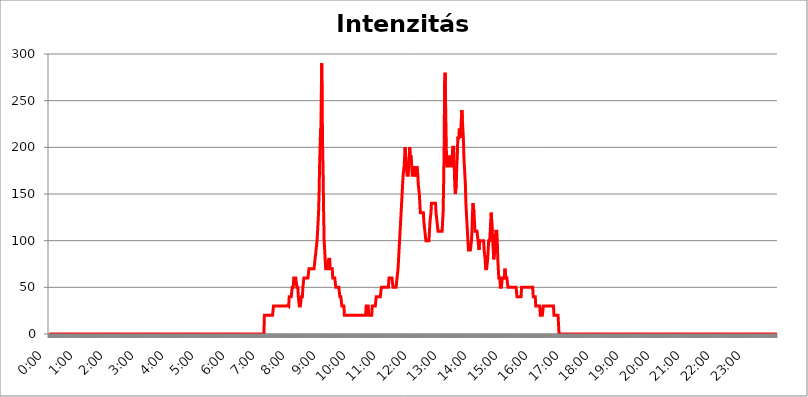
| Category | Intenzitás (W/m2) |
|---|---|
| 0.0 | 0 |
| 0.0006944444444444445 | 0 |
| 0.001388888888888889 | 0 |
| 0.0020833333333333333 | 0 |
| 0.002777777777777778 | 0 |
| 0.003472222222222222 | 0 |
| 0.004166666666666667 | 0 |
| 0.004861111111111111 | 0 |
| 0.005555555555555556 | 0 |
| 0.0062499999999999995 | 0 |
| 0.006944444444444444 | 0 |
| 0.007638888888888889 | 0 |
| 0.008333333333333333 | 0 |
| 0.009027777777777779 | 0 |
| 0.009722222222222222 | 0 |
| 0.010416666666666666 | 0 |
| 0.011111111111111112 | 0 |
| 0.011805555555555555 | 0 |
| 0.012499999999999999 | 0 |
| 0.013194444444444444 | 0 |
| 0.013888888888888888 | 0 |
| 0.014583333333333332 | 0 |
| 0.015277777777777777 | 0 |
| 0.015972222222222224 | 0 |
| 0.016666666666666666 | 0 |
| 0.017361111111111112 | 0 |
| 0.018055555555555557 | 0 |
| 0.01875 | 0 |
| 0.019444444444444445 | 0 |
| 0.02013888888888889 | 0 |
| 0.020833333333333332 | 0 |
| 0.02152777777777778 | 0 |
| 0.022222222222222223 | 0 |
| 0.02291666666666667 | 0 |
| 0.02361111111111111 | 0 |
| 0.024305555555555556 | 0 |
| 0.024999999999999998 | 0 |
| 0.025694444444444447 | 0 |
| 0.02638888888888889 | 0 |
| 0.027083333333333334 | 0 |
| 0.027777777777777776 | 0 |
| 0.02847222222222222 | 0 |
| 0.029166666666666664 | 0 |
| 0.029861111111111113 | 0 |
| 0.030555555555555555 | 0 |
| 0.03125 | 0 |
| 0.03194444444444445 | 0 |
| 0.03263888888888889 | 0 |
| 0.03333333333333333 | 0 |
| 0.034027777777777775 | 0 |
| 0.034722222222222224 | 0 |
| 0.035416666666666666 | 0 |
| 0.036111111111111115 | 0 |
| 0.03680555555555556 | 0 |
| 0.0375 | 0 |
| 0.03819444444444444 | 0 |
| 0.03888888888888889 | 0 |
| 0.03958333333333333 | 0 |
| 0.04027777777777778 | 0 |
| 0.04097222222222222 | 0 |
| 0.041666666666666664 | 0 |
| 0.042361111111111106 | 0 |
| 0.04305555555555556 | 0 |
| 0.043750000000000004 | 0 |
| 0.044444444444444446 | 0 |
| 0.04513888888888889 | 0 |
| 0.04583333333333334 | 0 |
| 0.04652777777777778 | 0 |
| 0.04722222222222222 | 0 |
| 0.04791666666666666 | 0 |
| 0.04861111111111111 | 0 |
| 0.049305555555555554 | 0 |
| 0.049999999999999996 | 0 |
| 0.05069444444444445 | 0 |
| 0.051388888888888894 | 0 |
| 0.052083333333333336 | 0 |
| 0.05277777777777778 | 0 |
| 0.05347222222222222 | 0 |
| 0.05416666666666667 | 0 |
| 0.05486111111111111 | 0 |
| 0.05555555555555555 | 0 |
| 0.05625 | 0 |
| 0.05694444444444444 | 0 |
| 0.057638888888888885 | 0 |
| 0.05833333333333333 | 0 |
| 0.05902777777777778 | 0 |
| 0.059722222222222225 | 0 |
| 0.06041666666666667 | 0 |
| 0.061111111111111116 | 0 |
| 0.06180555555555556 | 0 |
| 0.0625 | 0 |
| 0.06319444444444444 | 0 |
| 0.06388888888888888 | 0 |
| 0.06458333333333334 | 0 |
| 0.06527777777777778 | 0 |
| 0.06597222222222222 | 0 |
| 0.06666666666666667 | 0 |
| 0.06736111111111111 | 0 |
| 0.06805555555555555 | 0 |
| 0.06874999999999999 | 0 |
| 0.06944444444444443 | 0 |
| 0.07013888888888889 | 0 |
| 0.07083333333333333 | 0 |
| 0.07152777777777779 | 0 |
| 0.07222222222222223 | 0 |
| 0.07291666666666667 | 0 |
| 0.07361111111111111 | 0 |
| 0.07430555555555556 | 0 |
| 0.075 | 0 |
| 0.07569444444444444 | 0 |
| 0.0763888888888889 | 0 |
| 0.07708333333333334 | 0 |
| 0.07777777777777778 | 0 |
| 0.07847222222222222 | 0 |
| 0.07916666666666666 | 0 |
| 0.0798611111111111 | 0 |
| 0.08055555555555556 | 0 |
| 0.08125 | 0 |
| 0.08194444444444444 | 0 |
| 0.08263888888888889 | 0 |
| 0.08333333333333333 | 0 |
| 0.08402777777777777 | 0 |
| 0.08472222222222221 | 0 |
| 0.08541666666666665 | 0 |
| 0.08611111111111112 | 0 |
| 0.08680555555555557 | 0 |
| 0.08750000000000001 | 0 |
| 0.08819444444444445 | 0 |
| 0.08888888888888889 | 0 |
| 0.08958333333333333 | 0 |
| 0.09027777777777778 | 0 |
| 0.09097222222222222 | 0 |
| 0.09166666666666667 | 0 |
| 0.09236111111111112 | 0 |
| 0.09305555555555556 | 0 |
| 0.09375 | 0 |
| 0.09444444444444444 | 0 |
| 0.09513888888888888 | 0 |
| 0.09583333333333333 | 0 |
| 0.09652777777777777 | 0 |
| 0.09722222222222222 | 0 |
| 0.09791666666666667 | 0 |
| 0.09861111111111111 | 0 |
| 0.09930555555555555 | 0 |
| 0.09999999999999999 | 0 |
| 0.10069444444444443 | 0 |
| 0.1013888888888889 | 0 |
| 0.10208333333333335 | 0 |
| 0.10277777777777779 | 0 |
| 0.10347222222222223 | 0 |
| 0.10416666666666667 | 0 |
| 0.10486111111111111 | 0 |
| 0.10555555555555556 | 0 |
| 0.10625 | 0 |
| 0.10694444444444444 | 0 |
| 0.1076388888888889 | 0 |
| 0.10833333333333334 | 0 |
| 0.10902777777777778 | 0 |
| 0.10972222222222222 | 0 |
| 0.11041666666666666 | 0 |
| 0.1111111111111111 | 0 |
| 0.11180555555555556 | 0 |
| 0.1125 | 0 |
| 0.11319444444444444 | 0 |
| 0.11388888888888889 | 0 |
| 0.11458333333333333 | 0 |
| 0.11527777777777777 | 0 |
| 0.11597222222222221 | 0 |
| 0.11666666666666665 | 0 |
| 0.1173611111111111 | 0 |
| 0.11805555555555557 | 0 |
| 0.11875000000000001 | 0 |
| 0.11944444444444445 | 0 |
| 0.12013888888888889 | 0 |
| 0.12083333333333333 | 0 |
| 0.12152777777777778 | 0 |
| 0.12222222222222223 | 0 |
| 0.12291666666666667 | 0 |
| 0.12361111111111112 | 0 |
| 0.12430555555555556 | 0 |
| 0.125 | 0 |
| 0.12569444444444444 | 0 |
| 0.12638888888888888 | 0 |
| 0.12708333333333333 | 0 |
| 0.1277777777777778 | 0 |
| 0.12847222222222224 | 0 |
| 0.12916666666666668 | 0 |
| 0.12986111111111112 | 0 |
| 0.13055555555555556 | 0 |
| 0.13125 | 0 |
| 0.13194444444444445 | 0 |
| 0.1326388888888889 | 0 |
| 0.13333333333333333 | 0 |
| 0.13402777777777777 | 0 |
| 0.13472222222222222 | 0 |
| 0.13541666666666666 | 0 |
| 0.1361111111111111 | 0 |
| 0.13680555555555554 | 0 |
| 0.13749999999999998 | 0 |
| 0.13819444444444443 | 0 |
| 0.1388888888888889 | 0 |
| 0.13958333333333334 | 0 |
| 0.14027777777777778 | 0 |
| 0.14097222222222222 | 0 |
| 0.14166666666666666 | 0 |
| 0.1423611111111111 | 0 |
| 0.14305555555555557 | 0 |
| 0.14375000000000002 | 0 |
| 0.14444444444444446 | 0 |
| 0.1451388888888889 | 0 |
| 0.14583333333333334 | 0 |
| 0.14652777777777778 | 0 |
| 0.14722222222222223 | 0 |
| 0.14791666666666667 | 0 |
| 0.1486111111111111 | 0 |
| 0.14930555555555555 | 0 |
| 0.15 | 0 |
| 0.15069444444444444 | 0 |
| 0.15138888888888888 | 0 |
| 0.15208333333333332 | 0 |
| 0.15277777777777776 | 0 |
| 0.15347222222222223 | 0 |
| 0.15416666666666667 | 0 |
| 0.15486111111111112 | 0 |
| 0.15555555555555556 | 0 |
| 0.15625 | 0 |
| 0.15694444444444444 | 0 |
| 0.15763888888888888 | 0 |
| 0.15833333333333333 | 0 |
| 0.15902777777777777 | 0 |
| 0.15972222222222224 | 0 |
| 0.16041666666666668 | 0 |
| 0.16111111111111112 | 0 |
| 0.16180555555555556 | 0 |
| 0.1625 | 0 |
| 0.16319444444444445 | 0 |
| 0.1638888888888889 | 0 |
| 0.16458333333333333 | 0 |
| 0.16527777777777777 | 0 |
| 0.16597222222222222 | 0 |
| 0.16666666666666666 | 0 |
| 0.1673611111111111 | 0 |
| 0.16805555555555554 | 0 |
| 0.16874999999999998 | 0 |
| 0.16944444444444443 | 0 |
| 0.17013888888888887 | 0 |
| 0.1708333333333333 | 0 |
| 0.17152777777777775 | 0 |
| 0.17222222222222225 | 0 |
| 0.1729166666666667 | 0 |
| 0.17361111111111113 | 0 |
| 0.17430555555555557 | 0 |
| 0.17500000000000002 | 0 |
| 0.17569444444444446 | 0 |
| 0.1763888888888889 | 0 |
| 0.17708333333333334 | 0 |
| 0.17777777777777778 | 0 |
| 0.17847222222222223 | 0 |
| 0.17916666666666667 | 0 |
| 0.1798611111111111 | 0 |
| 0.18055555555555555 | 0 |
| 0.18125 | 0 |
| 0.18194444444444444 | 0 |
| 0.1826388888888889 | 0 |
| 0.18333333333333335 | 0 |
| 0.1840277777777778 | 0 |
| 0.18472222222222223 | 0 |
| 0.18541666666666667 | 0 |
| 0.18611111111111112 | 0 |
| 0.18680555555555556 | 0 |
| 0.1875 | 0 |
| 0.18819444444444444 | 0 |
| 0.18888888888888888 | 0 |
| 0.18958333333333333 | 0 |
| 0.19027777777777777 | 0 |
| 0.1909722222222222 | 0 |
| 0.19166666666666665 | 0 |
| 0.19236111111111112 | 0 |
| 0.19305555555555554 | 0 |
| 0.19375 | 0 |
| 0.19444444444444445 | 0 |
| 0.1951388888888889 | 0 |
| 0.19583333333333333 | 0 |
| 0.19652777777777777 | 0 |
| 0.19722222222222222 | 0 |
| 0.19791666666666666 | 0 |
| 0.1986111111111111 | 0 |
| 0.19930555555555554 | 0 |
| 0.19999999999999998 | 0 |
| 0.20069444444444443 | 0 |
| 0.20138888888888887 | 0 |
| 0.2020833333333333 | 0 |
| 0.2027777777777778 | 0 |
| 0.2034722222222222 | 0 |
| 0.2041666666666667 | 0 |
| 0.20486111111111113 | 0 |
| 0.20555555555555557 | 0 |
| 0.20625000000000002 | 0 |
| 0.20694444444444446 | 0 |
| 0.2076388888888889 | 0 |
| 0.20833333333333334 | 0 |
| 0.20902777777777778 | 0 |
| 0.20972222222222223 | 0 |
| 0.21041666666666667 | 0 |
| 0.2111111111111111 | 0 |
| 0.21180555555555555 | 0 |
| 0.2125 | 0 |
| 0.21319444444444444 | 0 |
| 0.2138888888888889 | 0 |
| 0.21458333333333335 | 0 |
| 0.2152777777777778 | 0 |
| 0.21597222222222223 | 0 |
| 0.21666666666666667 | 0 |
| 0.21736111111111112 | 0 |
| 0.21805555555555556 | 0 |
| 0.21875 | 0 |
| 0.21944444444444444 | 0 |
| 0.22013888888888888 | 0 |
| 0.22083333333333333 | 0 |
| 0.22152777777777777 | 0 |
| 0.2222222222222222 | 0 |
| 0.22291666666666665 | 0 |
| 0.2236111111111111 | 0 |
| 0.22430555555555556 | 0 |
| 0.225 | 0 |
| 0.22569444444444445 | 0 |
| 0.2263888888888889 | 0 |
| 0.22708333333333333 | 0 |
| 0.22777777777777777 | 0 |
| 0.22847222222222222 | 0 |
| 0.22916666666666666 | 0 |
| 0.2298611111111111 | 0 |
| 0.23055555555555554 | 0 |
| 0.23124999999999998 | 0 |
| 0.23194444444444443 | 0 |
| 0.23263888888888887 | 0 |
| 0.2333333333333333 | 0 |
| 0.2340277777777778 | 0 |
| 0.2347222222222222 | 0 |
| 0.2354166666666667 | 0 |
| 0.23611111111111113 | 0 |
| 0.23680555555555557 | 0 |
| 0.23750000000000002 | 0 |
| 0.23819444444444446 | 0 |
| 0.2388888888888889 | 0 |
| 0.23958333333333334 | 0 |
| 0.24027777777777778 | 0 |
| 0.24097222222222223 | 0 |
| 0.24166666666666667 | 0 |
| 0.2423611111111111 | 0 |
| 0.24305555555555555 | 0 |
| 0.24375 | 0 |
| 0.24444444444444446 | 0 |
| 0.24513888888888888 | 0 |
| 0.24583333333333335 | 0 |
| 0.2465277777777778 | 0 |
| 0.24722222222222223 | 0 |
| 0.24791666666666667 | 0 |
| 0.24861111111111112 | 0 |
| 0.24930555555555556 | 0 |
| 0.25 | 0 |
| 0.25069444444444444 | 0 |
| 0.2513888888888889 | 0 |
| 0.2520833333333333 | 0 |
| 0.25277777777777777 | 0 |
| 0.2534722222222222 | 0 |
| 0.25416666666666665 | 0 |
| 0.2548611111111111 | 0 |
| 0.2555555555555556 | 0 |
| 0.25625000000000003 | 0 |
| 0.2569444444444445 | 0 |
| 0.2576388888888889 | 0 |
| 0.25833333333333336 | 0 |
| 0.2590277777777778 | 0 |
| 0.25972222222222224 | 0 |
| 0.2604166666666667 | 0 |
| 0.2611111111111111 | 0 |
| 0.26180555555555557 | 0 |
| 0.2625 | 0 |
| 0.26319444444444445 | 0 |
| 0.2638888888888889 | 0 |
| 0.26458333333333334 | 0 |
| 0.2652777777777778 | 0 |
| 0.2659722222222222 | 0 |
| 0.26666666666666666 | 0 |
| 0.2673611111111111 | 0 |
| 0.26805555555555555 | 0 |
| 0.26875 | 0 |
| 0.26944444444444443 | 0 |
| 0.2701388888888889 | 0 |
| 0.2708333333333333 | 0 |
| 0.27152777777777776 | 0 |
| 0.2722222222222222 | 0 |
| 0.27291666666666664 | 0 |
| 0.2736111111111111 | 0 |
| 0.2743055555555555 | 0 |
| 0.27499999999999997 | 0 |
| 0.27569444444444446 | 0 |
| 0.27638888888888885 | 0 |
| 0.27708333333333335 | 0 |
| 0.2777777777777778 | 0 |
| 0.27847222222222223 | 0 |
| 0.2791666666666667 | 0 |
| 0.2798611111111111 | 0 |
| 0.28055555555555556 | 0 |
| 0.28125 | 0 |
| 0.28194444444444444 | 0 |
| 0.2826388888888889 | 0 |
| 0.2833333333333333 | 0 |
| 0.28402777777777777 | 0 |
| 0.2847222222222222 | 0 |
| 0.28541666666666665 | 0 |
| 0.28611111111111115 | 0 |
| 0.28680555555555554 | 0 |
| 0.28750000000000003 | 0 |
| 0.2881944444444445 | 0 |
| 0.28958333333333336 | 0 |
| 0.2902777777777778 | 0 |
| 0.29097222222222224 | 0 |
| 0.29097222222222224 | 0 |
| 0.2916666666666667 | 0 |
| 0.2923611111111111 | 0 |
| 0.29305555555555557 | 0 |
| 0.29375 | 0 |
| 0.29444444444444445 | 0 |
| 0.2951388888888889 | 20 |
| 0.29583333333333334 | 20 |
| 0.2965277777777778 | 20 |
| 0.2972222222222222 | 20 |
| 0.2986111111111111 | 20 |
| 0.29930555555555555 | 20 |
| 0.3 | 20 |
| 0.30069444444444443 | 20 |
| 0.3013888888888889 | 20 |
| 0.3020833333333333 | 20 |
| 0.3020833333333333 | 20 |
| 0.30277777777777776 | 20 |
| 0.3034722222222222 | 20 |
| 0.30416666666666664 | 20 |
| 0.3048611111111111 | 20 |
| 0.3055555555555555 | 20 |
| 0.30624999999999997 | 20 |
| 0.3076388888888889 | 20 |
| 0.30833333333333335 | 30 |
| 0.3090277777777778 | 30 |
| 0.30972222222222223 | 30 |
| 0.3104166666666667 | 30 |
| 0.3111111111111111 | 30 |
| 0.31180555555555556 | 30 |
| 0.3125 | 30 |
| 0.31319444444444444 | 30 |
| 0.31319444444444444 | 30 |
| 0.3138888888888889 | 30 |
| 0.3145833333333333 | 30 |
| 0.31527777777777777 | 30 |
| 0.31666666666666665 | 30 |
| 0.31736111111111115 | 30 |
| 0.31805555555555554 | 30 |
| 0.31875000000000003 | 30 |
| 0.3194444444444445 | 30 |
| 0.3201388888888889 | 30 |
| 0.32083333333333336 | 30 |
| 0.3215277777777778 | 30 |
| 0.32222222222222224 | 30 |
| 0.3229166666666667 | 30 |
| 0.3236111111111111 | 30 |
| 0.32430555555555557 | 30 |
| 0.32430555555555557 | 30 |
| 0.32569444444444445 | 30 |
| 0.3263888888888889 | 30 |
| 0.32708333333333334 | 30 |
| 0.32708333333333334 | 31 |
| 0.3277777777777778 | 30 |
| 0.3284722222222222 | 30 |
| 0.32916666666666666 | 40 |
| 0.3298611111111111 | 40 |
| 0.33055555555555555 | 40 |
| 0.33125 | 40 |
| 0.33194444444444443 | 40 |
| 0.3326388888888889 | 40 |
| 0.3333333333333333 | 50 |
| 0.3340277777777778 | 50 |
| 0.3347222222222222 | 50 |
| 0.3354166666666667 | 60 |
| 0.3361111111111111 | 60 |
| 0.3368055555555556 | 60 |
| 0.33749999999999997 | 60 |
| 0.33819444444444446 | 60 |
| 0.33888888888888885 | 60 |
| 0.33958333333333335 | 50 |
| 0.34027777777777773 | 50 |
| 0.34097222222222223 | 50 |
| 0.3416666666666666 | 40 |
| 0.3423611111111111 | 40 |
| 0.3430555555555555 | 30 |
| 0.34375 | 30 |
| 0.3444444444444445 | 30 |
| 0.3451388888888889 | 30 |
| 0.3458333333333334 | 40 |
| 0.34652777777777777 | 40 |
| 0.34722222222222227 | 40 |
| 0.34791666666666665 | 50 |
| 0.34861111111111115 | 50 |
| 0.34930555555555554 | 60 |
| 0.35000000000000003 | 60 |
| 0.3506944444444444 | 60 |
| 0.3513888888888889 | 60 |
| 0.3520833333333333 | 60 |
| 0.3527777777777778 | 60 |
| 0.3534722222222222 | 60 |
| 0.3541666666666667 | 60 |
| 0.3548611111111111 | 60 |
| 0.35555555555555557 | 60 |
| 0.35625 | 70 |
| 0.35694444444444445 | 70 |
| 0.3576388888888889 | 70 |
| 0.35833333333333334 | 70 |
| 0.3590277777777778 | 70 |
| 0.3597222222222222 | 70 |
| 0.36041666666666666 | 70 |
| 0.3611111111111111 | 70 |
| 0.36180555555555555 | 70 |
| 0.3625 | 70 |
| 0.36319444444444443 | 70 |
| 0.3638888888888889 | 70 |
| 0.3645833333333333 | 80 |
| 0.3652777777777778 | 80 |
| 0.3659722222222222 | 90 |
| 0.3666666666666667 | 90 |
| 0.3673611111111111 | 100 |
| 0.3680555555555556 | 100 |
| 0.36874999999999997 | 120 |
| 0.36944444444444446 | 130 |
| 0.37013888888888885 | 150 |
| 0.37083333333333335 | 180 |
| 0.37152777777777773 | 200 |
| 0.37222222222222223 | 220 |
| 0.3729166666666666 | 210 |
| 0.3736111111111111 | 290 |
| 0.3743055555555555 | 250 |
| 0.375 | 200 |
| 0.3756944444444445 | 170 |
| 0.3763888888888889 | 130 |
| 0.3770833333333334 | 100 |
| 0.37777777777777777 | 90 |
| 0.37847222222222227 | 80 |
| 0.37916666666666665 | 70 |
| 0.37986111111111115 | 70 |
| 0.38055555555555554 | 70 |
| 0.38125000000000003 | 70 |
| 0.3819444444444444 | 70 |
| 0.3826388888888889 | 70 |
| 0.3833333333333333 | 80 |
| 0.3840277777777778 | 80 |
| 0.3847222222222222 | 80 |
| 0.3854166666666667 | 70 |
| 0.3861111111111111 | 70 |
| 0.38680555555555557 | 70 |
| 0.3875 | 70 |
| 0.38819444444444445 | 70 |
| 0.3888888888888889 | 60 |
| 0.38958333333333334 | 60 |
| 0.3902777777777778 | 60 |
| 0.3909722222222222 | 60 |
| 0.39166666666666666 | 60 |
| 0.3923611111111111 | 60 |
| 0.39305555555555555 | 50 |
| 0.39375 | 50 |
| 0.39444444444444443 | 50 |
| 0.3951388888888889 | 50 |
| 0.3958333333333333 | 50 |
| 0.3965277777777778 | 50 |
| 0.3972222222222222 | 50 |
| 0.3979166666666667 | 50 |
| 0.3986111111111111 | 40 |
| 0.3993055555555556 | 40 |
| 0.39999999999999997 | 40 |
| 0.40069444444444446 | 40 |
| 0.40138888888888885 | 30 |
| 0.40208333333333335 | 30 |
| 0.40277777777777773 | 30 |
| 0.40347222222222223 | 30 |
| 0.4041666666666666 | 30 |
| 0.4048611111111111 | 20 |
| 0.4055555555555555 | 20 |
| 0.40625 | 20 |
| 0.4069444444444445 | 20 |
| 0.4076388888888889 | 20 |
| 0.4083333333333334 | 20 |
| 0.40902777777777777 | 20 |
| 0.40972222222222227 | 20 |
| 0.41041666666666665 | 20 |
| 0.41111111111111115 | 20 |
| 0.41180555555555554 | 20 |
| 0.41250000000000003 | 20 |
| 0.4131944444444444 | 20 |
| 0.4138888888888889 | 20 |
| 0.4145833333333333 | 20 |
| 0.4152777777777778 | 20 |
| 0.4159722222222222 | 20 |
| 0.4166666666666667 | 20 |
| 0.4173611111111111 | 20 |
| 0.41805555555555557 | 20 |
| 0.41875 | 20 |
| 0.41944444444444445 | 20 |
| 0.4201388888888889 | 20 |
| 0.42083333333333334 | 20 |
| 0.4215277777777778 | 20 |
| 0.4222222222222222 | 20 |
| 0.42291666666666666 | 20 |
| 0.4236111111111111 | 20 |
| 0.42430555555555555 | 20 |
| 0.425 | 20 |
| 0.42569444444444443 | 20 |
| 0.4263888888888889 | 20 |
| 0.4270833333333333 | 20 |
| 0.4277777777777778 | 20 |
| 0.4284722222222222 | 20 |
| 0.4291666666666667 | 20 |
| 0.4298611111111111 | 20 |
| 0.4305555555555556 | 20 |
| 0.43124999999999997 | 20 |
| 0.43194444444444446 | 20 |
| 0.43263888888888885 | 20 |
| 0.43333333333333335 | 20 |
| 0.43402777777777773 | 20 |
| 0.43472222222222223 | 30 |
| 0.4354166666666666 | 30 |
| 0.4361111111111111 | 30 |
| 0.4368055555555555 | 30 |
| 0.4375 | 30 |
| 0.4381944444444445 | 20 |
| 0.4388888888888889 | 20 |
| 0.4395833333333334 | 20 |
| 0.44027777777777777 | 20 |
| 0.44097222222222227 | 20 |
| 0.44166666666666665 | 20 |
| 0.44236111111111115 | 20 |
| 0.44305555555555554 | 30 |
| 0.44375000000000003 | 30 |
| 0.4444444444444444 | 30 |
| 0.4451388888888889 | 30 |
| 0.4458333333333333 | 30 |
| 0.4465277777777778 | 30 |
| 0.4472222222222222 | 30 |
| 0.4479166666666667 | 30 |
| 0.4486111111111111 | 40 |
| 0.44930555555555557 | 40 |
| 0.45 | 40 |
| 0.45069444444444445 | 40 |
| 0.4513888888888889 | 40 |
| 0.45208333333333334 | 40 |
| 0.4527777777777778 | 40 |
| 0.4534722222222222 | 40 |
| 0.45416666666666666 | 40 |
| 0.4548611111111111 | 40 |
| 0.45555555555555555 | 50 |
| 0.45625 | 50 |
| 0.45694444444444443 | 50 |
| 0.4576388888888889 | 50 |
| 0.4583333333333333 | 50 |
| 0.4590277777777778 | 50 |
| 0.4597222222222222 | 50 |
| 0.4604166666666667 | 50 |
| 0.4611111111111111 | 50 |
| 0.4618055555555556 | 50 |
| 0.46249999999999997 | 50 |
| 0.46319444444444446 | 50 |
| 0.46388888888888885 | 50 |
| 0.46458333333333335 | 50 |
| 0.46527777777777773 | 50 |
| 0.46597222222222223 | 60 |
| 0.4666666666666666 | 60 |
| 0.4673611111111111 | 60 |
| 0.4680555555555555 | 60 |
| 0.46875 | 60 |
| 0.4694444444444445 | 60 |
| 0.4701388888888889 | 60 |
| 0.4708333333333334 | 60 |
| 0.47152777777777777 | 50 |
| 0.47222222222222227 | 50 |
| 0.47291666666666665 | 50 |
| 0.47361111111111115 | 50 |
| 0.47430555555555554 | 50 |
| 0.47500000000000003 | 50 |
| 0.4756944444444444 | 50 |
| 0.4763888888888889 | 50 |
| 0.4770833333333333 | 60 |
| 0.4777777777777778 | 60 |
| 0.4784722222222222 | 70 |
| 0.4791666666666667 | 80 |
| 0.4798611111111111 | 90 |
| 0.48055555555555557 | 100 |
| 0.48125 | 110 |
| 0.48194444444444445 | 120 |
| 0.4826388888888889 | 130 |
| 0.48333333333333334 | 140 |
| 0.4840277777777778 | 150 |
| 0.4847222222222222 | 160 |
| 0.48541666666666666 | 170 |
| 0.4861111111111111 | 170 |
| 0.48680555555555555 | 180 |
| 0.4875 | 190 |
| 0.48819444444444443 | 200 |
| 0.4888888888888889 | 190 |
| 0.4895833333333333 | 180 |
| 0.4902777777777778 | 180 |
| 0.4909722222222222 | 170 |
| 0.4916666666666667 | 170 |
| 0.4923611111111111 | 170 |
| 0.4930555555555556 | 180 |
| 0.49374999999999997 | 190 |
| 0.49444444444444446 | 200 |
| 0.49513888888888885 | 190 |
| 0.49583333333333335 | 190 |
| 0.49652777777777773 | 190 |
| 0.49722222222222223 | 180 |
| 0.4979166666666666 | 170 |
| 0.4986111111111111 | 170 |
| 0.4993055555555555 | 170 |
| 0.5 | 170 |
| 0.5006944444444444 | 170 |
| 0.5013888888888889 | 180 |
| 0.5020833333333333 | 170 |
| 0.5027777777777778 | 170 |
| 0.5034722222222222 | 170 |
| 0.5041666666666667 | 180 |
| 0.5048611111111111 | 180 |
| 0.5055555555555555 | 170 |
| 0.50625 | 160 |
| 0.5069444444444444 | 160 |
| 0.5076388888888889 | 150 |
| 0.5083333333333333 | 140 |
| 0.5090277777777777 | 130 |
| 0.5097222222222222 | 130 |
| 0.5104166666666666 | 130 |
| 0.5111111111111112 | 130 |
| 0.5118055555555555 | 130 |
| 0.5125000000000001 | 130 |
| 0.5131944444444444 | 130 |
| 0.513888888888889 | 120 |
| 0.5145833333333333 | 120 |
| 0.5152777777777778 | 110 |
| 0.5159722222222222 | 110 |
| 0.5166666666666667 | 100 |
| 0.517361111111111 | 100 |
| 0.5180555555555556 | 100 |
| 0.5187499999999999 | 100 |
| 0.5194444444444445 | 100 |
| 0.5201388888888888 | 100 |
| 0.5208333333333334 | 100 |
| 0.5215277777777778 | 110 |
| 0.5222222222222223 | 120 |
| 0.5229166666666667 | 120 |
| 0.5236111111111111 | 130 |
| 0.5243055555555556 | 140 |
| 0.525 | 140 |
| 0.5256944444444445 | 140 |
| 0.5263888888888889 | 140 |
| 0.5270833333333333 | 140 |
| 0.5277777777777778 | 140 |
| 0.5284722222222222 | 140 |
| 0.5291666666666667 | 140 |
| 0.5298611111111111 | 140 |
| 0.5305555555555556 | 130 |
| 0.53125 | 130 |
| 0.5319444444444444 | 120 |
| 0.5326388888888889 | 120 |
| 0.5333333333333333 | 110 |
| 0.5340277777777778 | 110 |
| 0.5347222222222222 | 110 |
| 0.5354166666666667 | 110 |
| 0.5361111111111111 | 110 |
| 0.5368055555555555 | 110 |
| 0.5375 | 110 |
| 0.5381944444444444 | 110 |
| 0.5388888888888889 | 110 |
| 0.5395833333333333 | 120 |
| 0.5402777777777777 | 130 |
| 0.5409722222222222 | 160 |
| 0.5416666666666666 | 200 |
| 0.5423611111111112 | 270 |
| 0.5430555555555555 | 280 |
| 0.5437500000000001 | 240 |
| 0.5444444444444444 | 210 |
| 0.545138888888889 | 180 |
| 0.5458333333333333 | 180 |
| 0.5465277777777778 | 180 |
| 0.5472222222222222 | 190 |
| 0.5479166666666667 | 190 |
| 0.548611111111111 | 190 |
| 0.5493055555555556 | 190 |
| 0.5499999999999999 | 190 |
| 0.5506944444444445 | 180 |
| 0.5513888888888888 | 180 |
| 0.5520833333333334 | 180 |
| 0.5527777777777778 | 190 |
| 0.5534722222222223 | 200 |
| 0.5541666666666667 | 200 |
| 0.5548611111111111 | 200 |
| 0.5555555555555556 | 180 |
| 0.55625 | 160 |
| 0.5569444444444445 | 150 |
| 0.5576388888888889 | 150 |
| 0.5583333333333333 | 160 |
| 0.5590277777777778 | 180 |
| 0.5597222222222222 | 190 |
| 0.5604166666666667 | 210 |
| 0.5611111111111111 | 210 |
| 0.5618055555555556 | 210 |
| 0.5625 | 220 |
| 0.5631944444444444 | 220 |
| 0.5638888888888889 | 210 |
| 0.5645833333333333 | 220 |
| 0.5652777777777778 | 230 |
| 0.5659722222222222 | 240 |
| 0.5666666666666667 | 230 |
| 0.5673611111111111 | 220 |
| 0.5680555555555555 | 210 |
| 0.56875 | 190 |
| 0.5694444444444444 | 180 |
| 0.5701388888888889 | 170 |
| 0.5708333333333333 | 160 |
| 0.5715277777777777 | 140 |
| 0.5722222222222222 | 130 |
| 0.5729166666666666 | 120 |
| 0.5736111111111112 | 110 |
| 0.5743055555555555 | 100 |
| 0.5750000000000001 | 90 |
| 0.5756944444444444 | 90 |
| 0.576388888888889 | 90 |
| 0.5770833333333333 | 90 |
| 0.5777777777777778 | 90 |
| 0.5784722222222222 | 90 |
| 0.5791666666666667 | 100 |
| 0.579861111111111 | 110 |
| 0.5805555555555556 | 130 |
| 0.5812499999999999 | 140 |
| 0.5819444444444445 | 140 |
| 0.5826388888888888 | 130 |
| 0.5833333333333334 | 120 |
| 0.5840277777777778 | 110 |
| 0.5847222222222223 | 110 |
| 0.5854166666666667 | 110 |
| 0.5861111111111111 | 110 |
| 0.5868055555555556 | 110 |
| 0.5875 | 110 |
| 0.5881944444444445 | 100 |
| 0.5888888888888889 | 100 |
| 0.5895833333333333 | 90 |
| 0.5902777777777778 | 100 |
| 0.5909722222222222 | 100 |
| 0.5916666666666667 | 100 |
| 0.5923611111111111 | 100 |
| 0.5930555555555556 | 100 |
| 0.59375 | 100 |
| 0.5944444444444444 | 100 |
| 0.5951388888888889 | 100 |
| 0.5958333333333333 | 100 |
| 0.5965277777777778 | 90 |
| 0.5972222222222222 | 90 |
| 0.5979166666666667 | 80 |
| 0.5986111111111111 | 70 |
| 0.5993055555555555 | 70 |
| 0.6 | 70 |
| 0.6006944444444444 | 70 |
| 0.6013888888888889 | 80 |
| 0.6020833333333333 | 90 |
| 0.6027777777777777 | 100 |
| 0.6034722222222222 | 100 |
| 0.6041666666666666 | 100 |
| 0.6048611111111112 | 100 |
| 0.6055555555555555 | 120 |
| 0.6062500000000001 | 130 |
| 0.6069444444444444 | 130 |
| 0.607638888888889 | 110 |
| 0.6083333333333333 | 100 |
| 0.6090277777777778 | 90 |
| 0.6097222222222222 | 80 |
| 0.6104166666666667 | 80 |
| 0.611111111111111 | 90 |
| 0.6118055555555556 | 100 |
| 0.6124999999999999 | 110 |
| 0.6131944444444445 | 110 |
| 0.6138888888888888 | 110 |
| 0.6145833333333334 | 100 |
| 0.6152777777777778 | 80 |
| 0.6159722222222223 | 70 |
| 0.6166666666666667 | 60 |
| 0.6173611111111111 | 60 |
| 0.6180555555555556 | 60 |
| 0.61875 | 50 |
| 0.6194444444444445 | 50 |
| 0.6201388888888889 | 50 |
| 0.6208333333333333 | 50 |
| 0.6215277777777778 | 60 |
| 0.6222222222222222 | 60 |
| 0.6229166666666667 | 60 |
| 0.6236111111111111 | 60 |
| 0.6243055555555556 | 60 |
| 0.625 | 70 |
| 0.6256944444444444 | 70 |
| 0.6263888888888889 | 60 |
| 0.6270833333333333 | 60 |
| 0.6277777777777778 | 60 |
| 0.6284722222222222 | 60 |
| 0.6291666666666667 | 50 |
| 0.6298611111111111 | 50 |
| 0.6305555555555555 | 50 |
| 0.63125 | 50 |
| 0.6319444444444444 | 50 |
| 0.6326388888888889 | 50 |
| 0.6333333333333333 | 50 |
| 0.6340277777777777 | 50 |
| 0.6347222222222222 | 50 |
| 0.6354166666666666 | 50 |
| 0.6361111111111112 | 50 |
| 0.6368055555555555 | 50 |
| 0.6375000000000001 | 50 |
| 0.6381944444444444 | 50 |
| 0.638888888888889 | 50 |
| 0.6395833333333333 | 50 |
| 0.6402777777777778 | 50 |
| 0.6409722222222222 | 50 |
| 0.6416666666666667 | 40 |
| 0.642361111111111 | 40 |
| 0.6430555555555556 | 40 |
| 0.6437499999999999 | 40 |
| 0.6444444444444445 | 40 |
| 0.6451388888888888 | 40 |
| 0.6458333333333334 | 40 |
| 0.6465277777777778 | 40 |
| 0.6472222222222223 | 40 |
| 0.6479166666666667 | 50 |
| 0.6486111111111111 | 50 |
| 0.6493055555555556 | 50 |
| 0.65 | 50 |
| 0.6506944444444445 | 50 |
| 0.6513888888888889 | 50 |
| 0.6520833333333333 | 50 |
| 0.6527777777777778 | 50 |
| 0.6534722222222222 | 50 |
| 0.6541666666666667 | 50 |
| 0.6548611111111111 | 50 |
| 0.6555555555555556 | 50 |
| 0.65625 | 50 |
| 0.6569444444444444 | 50 |
| 0.6576388888888889 | 50 |
| 0.6583333333333333 | 50 |
| 0.6590277777777778 | 50 |
| 0.6597222222222222 | 50 |
| 0.6604166666666667 | 50 |
| 0.6611111111111111 | 50 |
| 0.6618055555555555 | 50 |
| 0.6625 | 50 |
| 0.6631944444444444 | 50 |
| 0.6638888888888889 | 40 |
| 0.6645833333333333 | 40 |
| 0.6652777777777777 | 40 |
| 0.6659722222222222 | 40 |
| 0.6666666666666666 | 40 |
| 0.6673611111111111 | 30 |
| 0.6680555555555556 | 30 |
| 0.6687500000000001 | 30 |
| 0.6694444444444444 | 30 |
| 0.6701388888888888 | 30 |
| 0.6708333333333334 | 30 |
| 0.6715277777777778 | 30 |
| 0.6722222222222222 | 30 |
| 0.6729166666666666 | 30 |
| 0.6736111111111112 | 20 |
| 0.6743055555555556 | 20 |
| 0.6749999999999999 | 20 |
| 0.6756944444444444 | 20 |
| 0.6763888888888889 | 20 |
| 0.6770833333333334 | 20 |
| 0.6777777777777777 | 30 |
| 0.6784722222222223 | 30 |
| 0.6791666666666667 | 30 |
| 0.6798611111111111 | 30 |
| 0.6805555555555555 | 30 |
| 0.68125 | 30 |
| 0.6819444444444445 | 30 |
| 0.6826388888888889 | 30 |
| 0.6833333333333332 | 30 |
| 0.6840277777777778 | 30 |
| 0.6847222222222222 | 30 |
| 0.6854166666666667 | 30 |
| 0.686111111111111 | 30 |
| 0.6868055555555556 | 30 |
| 0.6875 | 30 |
| 0.6881944444444444 | 30 |
| 0.688888888888889 | 30 |
| 0.6895833333333333 | 30 |
| 0.6902777777777778 | 30 |
| 0.6909722222222222 | 30 |
| 0.6916666666666668 | 30 |
| 0.6923611111111111 | 20 |
| 0.6930555555555555 | 20 |
| 0.69375 | 20 |
| 0.6944444444444445 | 20 |
| 0.6951388888888889 | 20 |
| 0.6958333333333333 | 20 |
| 0.6965277777777777 | 20 |
| 0.6972222222222223 | 20 |
| 0.6979166666666666 | 20 |
| 0.6986111111111111 | 20 |
| 0.6993055555555556 | 0 |
| 0.7000000000000001 | 0 |
| 0.7006944444444444 | 0 |
| 0.7013888888888888 | 0 |
| 0.7020833333333334 | 0 |
| 0.7027777777777778 | 0 |
| 0.7034722222222222 | 0 |
| 0.7041666666666666 | 0 |
| 0.7048611111111112 | 0 |
| 0.7055555555555556 | 0 |
| 0.7062499999999999 | 0 |
| 0.7069444444444444 | 0 |
| 0.7076388888888889 | 0 |
| 0.7083333333333334 | 0 |
| 0.7090277777777777 | 0 |
| 0.7097222222222223 | 0 |
| 0.7104166666666667 | 0 |
| 0.7111111111111111 | 0 |
| 0.7118055555555555 | 0 |
| 0.7125 | 0 |
| 0.7131944444444445 | 0 |
| 0.7138888888888889 | 0 |
| 0.7145833333333332 | 0 |
| 0.7152777777777778 | 0 |
| 0.7159722222222222 | 0 |
| 0.7166666666666667 | 0 |
| 0.717361111111111 | 0 |
| 0.7180555555555556 | 0 |
| 0.71875 | 0 |
| 0.7194444444444444 | 0 |
| 0.720138888888889 | 0 |
| 0.7208333333333333 | 0 |
| 0.7215277777777778 | 0 |
| 0.7222222222222222 | 0 |
| 0.7229166666666668 | 0 |
| 0.7236111111111111 | 0 |
| 0.7243055555555555 | 0 |
| 0.725 | 0 |
| 0.7256944444444445 | 0 |
| 0.7263888888888889 | 0 |
| 0.7270833333333333 | 0 |
| 0.7277777777777777 | 0 |
| 0.7284722222222223 | 0 |
| 0.7291666666666666 | 0 |
| 0.7298611111111111 | 0 |
| 0.7305555555555556 | 0 |
| 0.7312500000000001 | 0 |
| 0.7319444444444444 | 0 |
| 0.7326388888888888 | 0 |
| 0.7333333333333334 | 0 |
| 0.7340277777777778 | 0 |
| 0.7347222222222222 | 0 |
| 0.7354166666666666 | 0 |
| 0.7361111111111112 | 0 |
| 0.7368055555555556 | 0 |
| 0.7374999999999999 | 0 |
| 0.7381944444444444 | 0 |
| 0.7388888888888889 | 0 |
| 0.7395833333333334 | 0 |
| 0.7402777777777777 | 0 |
| 0.7409722222222223 | 0 |
| 0.7416666666666667 | 0 |
| 0.7423611111111111 | 0 |
| 0.7430555555555555 | 0 |
| 0.74375 | 0 |
| 0.7444444444444445 | 0 |
| 0.7451388888888889 | 0 |
| 0.7458333333333332 | 0 |
| 0.7465277777777778 | 0 |
| 0.7472222222222222 | 0 |
| 0.7479166666666667 | 0 |
| 0.748611111111111 | 0 |
| 0.7493055555555556 | 0 |
| 0.75 | 0 |
| 0.7506944444444444 | 0 |
| 0.751388888888889 | 0 |
| 0.7520833333333333 | 0 |
| 0.7527777777777778 | 0 |
| 0.7534722222222222 | 0 |
| 0.7541666666666668 | 0 |
| 0.7548611111111111 | 0 |
| 0.7555555555555555 | 0 |
| 0.75625 | 0 |
| 0.7569444444444445 | 0 |
| 0.7576388888888889 | 0 |
| 0.7583333333333333 | 0 |
| 0.7590277777777777 | 0 |
| 0.7597222222222223 | 0 |
| 0.7604166666666666 | 0 |
| 0.7611111111111111 | 0 |
| 0.7618055555555556 | 0 |
| 0.7625000000000001 | 0 |
| 0.7631944444444444 | 0 |
| 0.7638888888888888 | 0 |
| 0.7645833333333334 | 0 |
| 0.7652777777777778 | 0 |
| 0.7659722222222222 | 0 |
| 0.7666666666666666 | 0 |
| 0.7673611111111112 | 0 |
| 0.7680555555555556 | 0 |
| 0.7687499999999999 | 0 |
| 0.7694444444444444 | 0 |
| 0.7701388888888889 | 0 |
| 0.7708333333333334 | 0 |
| 0.7715277777777777 | 0 |
| 0.7722222222222223 | 0 |
| 0.7729166666666667 | 0 |
| 0.7736111111111111 | 0 |
| 0.7743055555555555 | 0 |
| 0.775 | 0 |
| 0.7756944444444445 | 0 |
| 0.7763888888888889 | 0 |
| 0.7770833333333332 | 0 |
| 0.7777777777777778 | 0 |
| 0.7784722222222222 | 0 |
| 0.7791666666666667 | 0 |
| 0.779861111111111 | 0 |
| 0.7805555555555556 | 0 |
| 0.78125 | 0 |
| 0.7819444444444444 | 0 |
| 0.782638888888889 | 0 |
| 0.7833333333333333 | 0 |
| 0.7840277777777778 | 0 |
| 0.7847222222222222 | 0 |
| 0.7854166666666668 | 0 |
| 0.7861111111111111 | 0 |
| 0.7868055555555555 | 0 |
| 0.7875 | 0 |
| 0.7881944444444445 | 0 |
| 0.7888888888888889 | 0 |
| 0.7895833333333333 | 0 |
| 0.7902777777777777 | 0 |
| 0.7909722222222223 | 0 |
| 0.7916666666666666 | 0 |
| 0.7923611111111111 | 0 |
| 0.7930555555555556 | 0 |
| 0.7937500000000001 | 0 |
| 0.7944444444444444 | 0 |
| 0.7951388888888888 | 0 |
| 0.7958333333333334 | 0 |
| 0.7965277777777778 | 0 |
| 0.7972222222222222 | 0 |
| 0.7979166666666666 | 0 |
| 0.7986111111111112 | 0 |
| 0.7993055555555556 | 0 |
| 0.7999999999999999 | 0 |
| 0.8006944444444444 | 0 |
| 0.8013888888888889 | 0 |
| 0.8020833333333334 | 0 |
| 0.8027777777777777 | 0 |
| 0.8034722222222223 | 0 |
| 0.8041666666666667 | 0 |
| 0.8048611111111111 | 0 |
| 0.8055555555555555 | 0 |
| 0.80625 | 0 |
| 0.8069444444444445 | 0 |
| 0.8076388888888889 | 0 |
| 0.8083333333333332 | 0 |
| 0.8090277777777778 | 0 |
| 0.8097222222222222 | 0 |
| 0.8104166666666667 | 0 |
| 0.811111111111111 | 0 |
| 0.8118055555555556 | 0 |
| 0.8125 | 0 |
| 0.8131944444444444 | 0 |
| 0.813888888888889 | 0 |
| 0.8145833333333333 | 0 |
| 0.8152777777777778 | 0 |
| 0.8159722222222222 | 0 |
| 0.8166666666666668 | 0 |
| 0.8173611111111111 | 0 |
| 0.8180555555555555 | 0 |
| 0.81875 | 0 |
| 0.8194444444444445 | 0 |
| 0.8201388888888889 | 0 |
| 0.8208333333333333 | 0 |
| 0.8215277777777777 | 0 |
| 0.8222222222222223 | 0 |
| 0.8229166666666666 | 0 |
| 0.8236111111111111 | 0 |
| 0.8243055555555556 | 0 |
| 0.8250000000000001 | 0 |
| 0.8256944444444444 | 0 |
| 0.8263888888888888 | 0 |
| 0.8270833333333334 | 0 |
| 0.8277777777777778 | 0 |
| 0.8284722222222222 | 0 |
| 0.8291666666666666 | 0 |
| 0.8298611111111112 | 0 |
| 0.8305555555555556 | 0 |
| 0.8312499999999999 | 0 |
| 0.8319444444444444 | 0 |
| 0.8326388888888889 | 0 |
| 0.8333333333333334 | 0 |
| 0.8340277777777777 | 0 |
| 0.8347222222222223 | 0 |
| 0.8354166666666667 | 0 |
| 0.8361111111111111 | 0 |
| 0.8368055555555555 | 0 |
| 0.8375 | 0 |
| 0.8381944444444445 | 0 |
| 0.8388888888888889 | 0 |
| 0.8395833333333332 | 0 |
| 0.8402777777777778 | 0 |
| 0.8409722222222222 | 0 |
| 0.8416666666666667 | 0 |
| 0.842361111111111 | 0 |
| 0.8430555555555556 | 0 |
| 0.84375 | 0 |
| 0.8444444444444444 | 0 |
| 0.845138888888889 | 0 |
| 0.8458333333333333 | 0 |
| 0.8465277777777778 | 0 |
| 0.8472222222222222 | 0 |
| 0.8479166666666668 | 0 |
| 0.8486111111111111 | 0 |
| 0.8493055555555555 | 0 |
| 0.85 | 0 |
| 0.8506944444444445 | 0 |
| 0.8513888888888889 | 0 |
| 0.8520833333333333 | 0 |
| 0.8527777777777777 | 0 |
| 0.8534722222222223 | 0 |
| 0.8541666666666666 | 0 |
| 0.8548611111111111 | 0 |
| 0.8555555555555556 | 0 |
| 0.8562500000000001 | 0 |
| 0.8569444444444444 | 0 |
| 0.8576388888888888 | 0 |
| 0.8583333333333334 | 0 |
| 0.8590277777777778 | 0 |
| 0.8597222222222222 | 0 |
| 0.8604166666666666 | 0 |
| 0.8611111111111112 | 0 |
| 0.8618055555555556 | 0 |
| 0.8624999999999999 | 0 |
| 0.8631944444444444 | 0 |
| 0.8638888888888889 | 0 |
| 0.8645833333333334 | 0 |
| 0.8652777777777777 | 0 |
| 0.8659722222222223 | 0 |
| 0.8666666666666667 | 0 |
| 0.8673611111111111 | 0 |
| 0.8680555555555555 | 0 |
| 0.86875 | 0 |
| 0.8694444444444445 | 0 |
| 0.8701388888888889 | 0 |
| 0.8708333333333332 | 0 |
| 0.8715277777777778 | 0 |
| 0.8722222222222222 | 0 |
| 0.8729166666666667 | 0 |
| 0.873611111111111 | 0 |
| 0.8743055555555556 | 0 |
| 0.875 | 0 |
| 0.8756944444444444 | 0 |
| 0.876388888888889 | 0 |
| 0.8770833333333333 | 0 |
| 0.8777777777777778 | 0 |
| 0.8784722222222222 | 0 |
| 0.8791666666666668 | 0 |
| 0.8798611111111111 | 0 |
| 0.8805555555555555 | 0 |
| 0.88125 | 0 |
| 0.8819444444444445 | 0 |
| 0.8826388888888889 | 0 |
| 0.8833333333333333 | 0 |
| 0.8840277777777777 | 0 |
| 0.8847222222222223 | 0 |
| 0.8854166666666666 | 0 |
| 0.8861111111111111 | 0 |
| 0.8868055555555556 | 0 |
| 0.8875000000000001 | 0 |
| 0.8881944444444444 | 0 |
| 0.8888888888888888 | 0 |
| 0.8895833333333334 | 0 |
| 0.8902777777777778 | 0 |
| 0.8909722222222222 | 0 |
| 0.8916666666666666 | 0 |
| 0.8923611111111112 | 0 |
| 0.8930555555555556 | 0 |
| 0.8937499999999999 | 0 |
| 0.8944444444444444 | 0 |
| 0.8951388888888889 | 0 |
| 0.8958333333333334 | 0 |
| 0.8965277777777777 | 0 |
| 0.8972222222222223 | 0 |
| 0.8979166666666667 | 0 |
| 0.8986111111111111 | 0 |
| 0.8993055555555555 | 0 |
| 0.9 | 0 |
| 0.9006944444444445 | 0 |
| 0.9013888888888889 | 0 |
| 0.9020833333333332 | 0 |
| 0.9027777777777778 | 0 |
| 0.9034722222222222 | 0 |
| 0.9041666666666667 | 0 |
| 0.904861111111111 | 0 |
| 0.9055555555555556 | 0 |
| 0.90625 | 0 |
| 0.9069444444444444 | 0 |
| 0.907638888888889 | 0 |
| 0.9083333333333333 | 0 |
| 0.9090277777777778 | 0 |
| 0.9097222222222222 | 0 |
| 0.9104166666666668 | 0 |
| 0.9111111111111111 | 0 |
| 0.9118055555555555 | 0 |
| 0.9125 | 0 |
| 0.9131944444444445 | 0 |
| 0.9138888888888889 | 0 |
| 0.9145833333333333 | 0 |
| 0.9152777777777777 | 0 |
| 0.9159722222222223 | 0 |
| 0.9166666666666666 | 0 |
| 0.9173611111111111 | 0 |
| 0.9180555555555556 | 0 |
| 0.9187500000000001 | 0 |
| 0.9194444444444444 | 0 |
| 0.9201388888888888 | 0 |
| 0.9208333333333334 | 0 |
| 0.9215277777777778 | 0 |
| 0.9222222222222222 | 0 |
| 0.9229166666666666 | 0 |
| 0.9236111111111112 | 0 |
| 0.9243055555555556 | 0 |
| 0.9249999999999999 | 0 |
| 0.9256944444444444 | 0 |
| 0.9263888888888889 | 0 |
| 0.9270833333333334 | 0 |
| 0.9277777777777777 | 0 |
| 0.9284722222222223 | 0 |
| 0.9291666666666667 | 0 |
| 0.9298611111111111 | 0 |
| 0.9305555555555555 | 0 |
| 0.93125 | 0 |
| 0.9319444444444445 | 0 |
| 0.9326388888888889 | 0 |
| 0.9333333333333332 | 0 |
| 0.9340277777777778 | 0 |
| 0.9347222222222222 | 0 |
| 0.9354166666666667 | 0 |
| 0.936111111111111 | 0 |
| 0.9368055555555556 | 0 |
| 0.9375 | 0 |
| 0.9381944444444444 | 0 |
| 0.938888888888889 | 0 |
| 0.9395833333333333 | 0 |
| 0.9402777777777778 | 0 |
| 0.9409722222222222 | 0 |
| 0.9416666666666668 | 0 |
| 0.9423611111111111 | 0 |
| 0.9430555555555555 | 0 |
| 0.94375 | 0 |
| 0.9444444444444445 | 0 |
| 0.9451388888888889 | 0 |
| 0.9458333333333333 | 0 |
| 0.9465277777777777 | 0 |
| 0.9472222222222223 | 0 |
| 0.9479166666666666 | 0 |
| 0.9486111111111111 | 0 |
| 0.9493055555555556 | 0 |
| 0.9500000000000001 | 0 |
| 0.9506944444444444 | 0 |
| 0.9513888888888888 | 0 |
| 0.9520833333333334 | 0 |
| 0.9527777777777778 | 0 |
| 0.9534722222222222 | 0 |
| 0.9541666666666666 | 0 |
| 0.9548611111111112 | 0 |
| 0.9555555555555556 | 0 |
| 0.9562499999999999 | 0 |
| 0.9569444444444444 | 0 |
| 0.9576388888888889 | 0 |
| 0.9583333333333334 | 0 |
| 0.9590277777777777 | 0 |
| 0.9597222222222223 | 0 |
| 0.9604166666666667 | 0 |
| 0.9611111111111111 | 0 |
| 0.9618055555555555 | 0 |
| 0.9625 | 0 |
| 0.9631944444444445 | 0 |
| 0.9638888888888889 | 0 |
| 0.9645833333333332 | 0 |
| 0.9652777777777778 | 0 |
| 0.9659722222222222 | 0 |
| 0.9666666666666667 | 0 |
| 0.967361111111111 | 0 |
| 0.9680555555555556 | 0 |
| 0.96875 | 0 |
| 0.9694444444444444 | 0 |
| 0.970138888888889 | 0 |
| 0.9708333333333333 | 0 |
| 0.9715277777777778 | 0 |
| 0.9722222222222222 | 0 |
| 0.9729166666666668 | 0 |
| 0.9736111111111111 | 0 |
| 0.9743055555555555 | 0 |
| 0.975 | 0 |
| 0.9756944444444445 | 0 |
| 0.9763888888888889 | 0 |
| 0.9770833333333333 | 0 |
| 0.9777777777777777 | 0 |
| 0.9784722222222223 | 0 |
| 0.9791666666666666 | 0 |
| 0.9798611111111111 | 0 |
| 0.9805555555555556 | 0 |
| 0.9812500000000001 | 0 |
| 0.9819444444444444 | 0 |
| 0.9826388888888888 | 0 |
| 0.9833333333333334 | 0 |
| 0.9840277777777778 | 0 |
| 0.9847222222222222 | 0 |
| 0.9854166666666666 | 0 |
| 0.9861111111111112 | 0 |
| 0.9868055555555556 | 0 |
| 0.9874999999999999 | 0 |
| 0.9881944444444444 | 0 |
| 0.9888888888888889 | 0 |
| 0.9895833333333334 | 0 |
| 0.9902777777777777 | 0 |
| 0.9909722222222223 | 0 |
| 0.9916666666666667 | 0 |
| 0.9923611111111111 | 0 |
| 0.9930555555555555 | 0 |
| 0.99375 | 0 |
| 0.9944444444444445 | 0 |
| 0.9951388888888889 | 0 |
| 0.9958333333333332 | 0 |
| 0.9965277777777778 | 0 |
| 0.9972222222222222 | 0 |
| 0.9979166666666667 | 0 |
| 0.998611111111111 | 0 |
| 0.9993055555555556 | 0 |